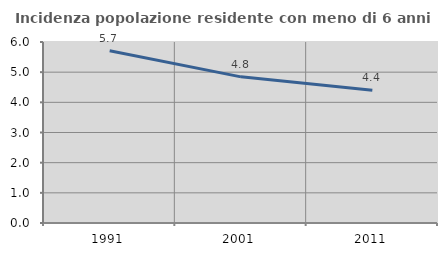
| Category | Incidenza popolazione residente con meno di 6 anni |
|---|---|
| 1991.0 | 5.71 |
| 2001.0 | 4.844 |
| 2011.0 | 4.398 |